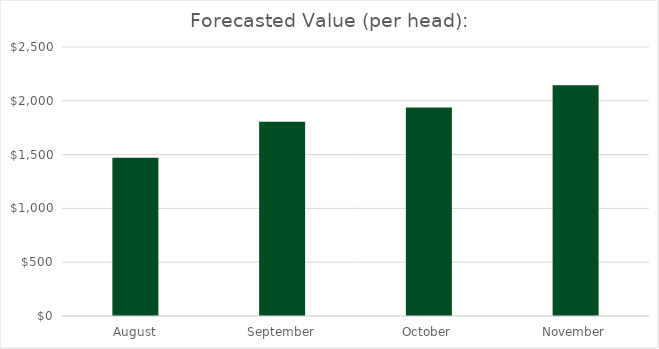
| Category | Series 0 |
|---|---|
| August | 1470.625 |
| September | 1804.17 |
| October | 1937.631 |
| November | 2144.091 |